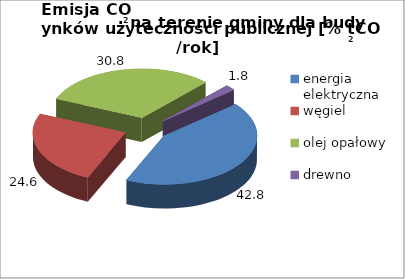
| Category | energia elektryczna węgiel olej opałowy drewno |
|---|---|
| energia elektryczna | 42.798 |
| węgiel | 24.58 |
| olej opałowy | 30.804 |
| drewno | 1.818 |